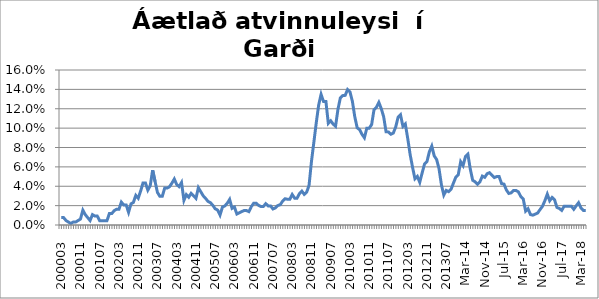
| Category | Series 0 |
|---|---|
| 200003 | 0.008 |
| 200004 | 0.008 |
| 200005 | 0.005 |
| 200006 | 0.003 |
| 200007 | 0.002 |
| 200008 | 0.003 |
| 200009 | 0.003 |
| 200010 | 0.005 |
| 200011 | 0.006 |
| 200012 | 0.015 |
| 200101 | 0.011 |
| 200102 | 0.008 |
| 200103 | 0.005 |
| 200104 | 0.011 |
| 200105 | 0.009 |
| 200106 | 0.009 |
| 200107 | 0.004 |
| 200108 | 0.004 |
| 200109 | 0.004 |
| 200110 | 0.004 |
| 200111 | 0.012 |
| 200112 | 0.012 |
| 200201 | 0.015 |
| 200202 | 0.016 |
| 200203 | 0.016 |
| 200204 | 0.024 |
| 200205 | 0.021 |
| 200206 | 0.021 |
| 200207 | 0.013 |
| 200208 | 0.022 |
| 200209 | 0.023 |
| 200210 | 0.031 |
| 200211 | 0.028 |
| 200212 | 0.035 |
| 200301 | 0.043 |
| 200302 | 0.043 |
| 200303 | 0.036 |
| 200304 | 0.041 |
| 200305 | 0.057 |
| 200306 | 0.045 |
| 200307 | 0.034 |
| 200308 | 0.03 |
| 200309 | 0.03 |
| 200310 | 0.038 |
| 200311 | 0.038 |
| 200312 | 0.039 |
| 200401 | 0.043 |
| 200402 | 0.047 |
| 200403 | 0.042 |
| 200404 | 0.04 |
| 200405 | 0.044 |
| 200406 | 0.025 |
| 200407 | 0.031 |
| 200408 | 0.029 |
| 200409 | 0.033 |
| 200410 | 0.03 |
| 200411 | 0.028 |
| 200412 | 0.039 |
| 200501 | 0.034 |
| 200502 | 0.03 |
| 200503 | 0.027 |
| 200504 | 0.024 |
| 200505 | 0.023 |
| 200506 | 0.02 |
| 200507 | 0.017 |
| 200508 | 0.015 |
| 200509 | 0.01 |
| 200510 | 0.018 |
| 200511 | 0.02 |
| 200512 | 0.022 |
| 200601 | 0.026 |
| 200602 | 0.017 |
| 200603 | 0.018 |
| 200604 | 0.011 |
| 200605 | 0.013 |
| 200606 | 0.014 |
| 200607 | 0.015 |
| 200608 | 0.015 |
| 200609 | 0.014 |
| 200610 | 0.019 |
| 200611 | 0.023 |
| 200612 | 0.023 |
| 200701 | 0.02 |
| 200702 | 0.019 |
| 200703 | 0.019 |
| 200704 | 0.022 |
| 200705 | 0.02 |
| 200706 | 0.02 |
| 200707 | 0.017 |
| 200708 | 0.018 |
| 200709 | 0.02 |
| 200710 | 0.021 |
| 200711 | 0.025 |
| 200712 | 0.027 |
| 200801 | 0.027 |
| 200802 | 0.027 |
| 200803 | 0.031 |
| 200804 | 0.028 |
| 200805 | 0.028 |
| 200806 | 0.032 |
| 200807 | 0.035 |
| 200808 | 0.032 |
| 200809 | 0.034 |
| 200810 | 0.041 |
| 200811 | 0.066 |
| 200812 | 0.085 |
| 200901 | 0.106 |
| 200902 | 0.124 |
| 200903 | 0.135 |
| 200904 | 0.128 |
| 200905 | 0.128 |
| 200906 | 0.105 |
| 200907 | 0.108 |
| 200908 | 0.104 |
| 200909 | 0.102 |
| 200910 | 0.119 |
| 200911 | 0.131 |
| 200912 | 0.134 |
| 201001 | 0.134 |
| 201002 | 0.14 |
| 201003 | 0.137 |
| 201004 | 0.128 |
| 201005 | 0.112 |
| 201006 | 0.1 |
| 201007 | 0.098 |
| 201008 | 0.094 |
| 201009 | 0.09 |
| 201010 | 0.1 |
| 201011 | 0.1 |
| 201012 | 0.104 |
| 201101 | 0.119 |
| 201102 | 0.122 |
| 201103 | 0.127 |
| 201104 | 0.12 |
| 201105 | 0.112 |
| 201106 | 0.096 |
| 201107 | 0.096 |
| 201108 | 0.094 |
| 201109 | 0.095 |
| 201110 | 0.101 |
| 201111 | 0.111 |
| 201112 | 0.114 |
| 201201 | 0.102 |
| 201202 | 0.104 |
| 201203 | 0.089 |
| 201204 | 0.073 |
| 201205 | 0.06 |
| 201206 | 0.048 |
| 201207 | 0.05 |
| 201208 | 0.044 |
| 201209 | 0.054 |
| 201210 | 0.063 |
| 201211 | 0.066 |
| 201212 | 0.076 |
| 201301 | 0.081 |
| 201302 | 0.071 |
| 201303 | 0.068 |
| 201304 | 0.058 |
| 201305 | 0.042 |
| 201306 | 0.031 |
| 201307 | 0.036 |
| 201308 | 0.034 |
| 201309 | 0.037 |
| 201310 | 0.043 |
| 201311 | 0.049 |
| 201312 | 0.052 |
| jan.14 | 0.065 |
| feb.14 | 0.061 |
| mar.14 | 0.071 |
| apr.14 | 0.073 |
| maí.14 | 0.058 |
| jún.14 | 0.046 |
| júl.14 | 0.045 |
| ágú.14 | 0.042 |
| sep.14 | 0.045 |
| okt.14 | 0.05 |
| nóv.14 | 0.049 |
| des.14 | 0.053 |
| jan.15 | 0.054 |
| feb.15 | 0.052 |
| mar.15 | 0.049 |
| apr.15 | 0.05 |
| maí.15 | 0.05 |
| jún.15 | 0.043 |
| júl.15 | 0.042 |
| ágú.15 | 0.036 |
| sep.15 | 0.033 |
| okt.15 | 0.033 |
| nóv.15 | 0.036 |
| des.15 | 0.036 |
| jan.16 | 0.034 |
| feb.16 | 0.029 |
| mar.16 | 0.027 |
| apr.16 | 0.014 |
| maí.16 | 0.017 |
| jún.16 | 0.011 |
| júl.16 | 0.01 |
| ágú.16 | 0.011 |
| sep.16 | 0.012 |
| okt.16 | 0.016 |
| nóv.16 | 0.019 |
| des.16 | 0.025 |
| jan.17 | 0.032 |
| feb.17 | 0.025 |
| mar.17 | 0.028 |
| apr.17 | 0.026 |
| maí.17 | 0.018 |
| jún.17 | 0.017 |
| júl.17 | 0.015 |
| ágú.17 | 0.019 |
| sep.17 | 0.019 |
| okt.17 | 0.019 |
| nóv.17 | 0.019 |
| des.17 | 0.016 |
| jan.18 | 0.02 |
| feb.18 | 0.023 |
| mar.18 | 0.018 |
| apr.18 | 0.015 |
| maí.18 | 0.015 |